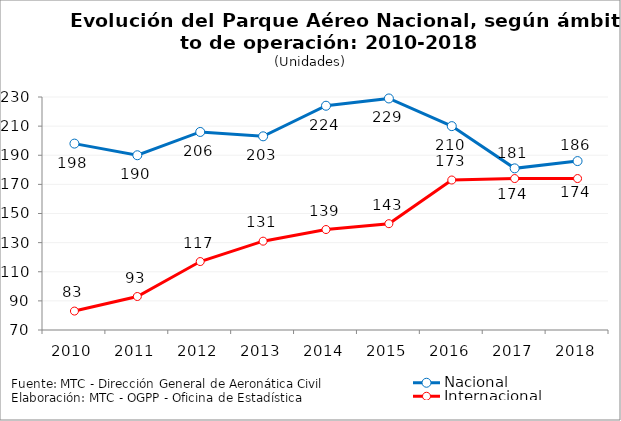
| Category | Nacional | Internacional |
|---|---|---|
| 2010.0 | 198 | 83 |
| 2011.0 | 190 | 93 |
| 2012.0 | 206 | 117 |
| 2013.0 | 203 | 131 |
| 2014.0 | 224 | 139 |
| 2015.0 | 229 | 143 |
| 2016.0 | 210 | 173 |
| 2017.0 | 181 | 174 |
| 2018.0 | 186 | 174 |